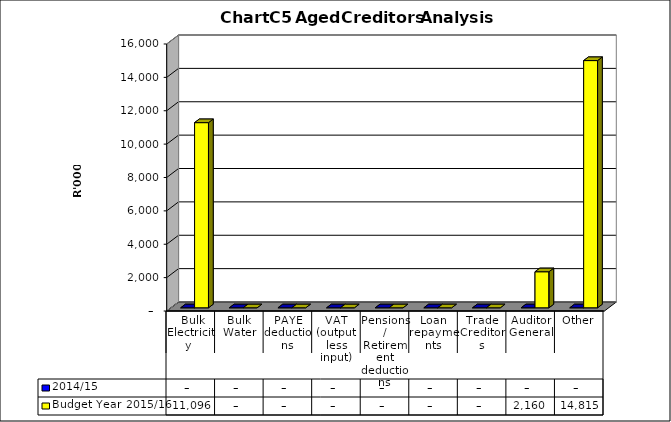
| Category | 2014/15 | Budget Year 2015/16 |
|---|---|---|
|  Bulk Electricity  | 0 | 11095588 |
| Bulk Water | 0 | 0 |
| PAYE deductions | 0 | 0 |
| VAT (output less input) | 0 | 0 |
| Pensions / Retirement deductions | 0 | 0 |
| Loan repayments | 0 | 0 |
| Trade Creditors | 0 | 0 |
| Auditor General | 0 | 2160218 |
| Other | 0 | 14814988 |